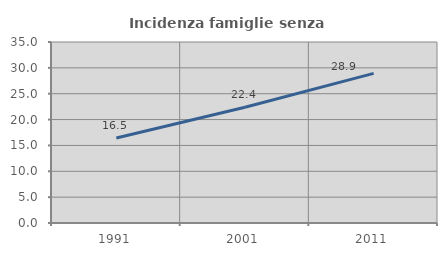
| Category | Incidenza famiglie senza nuclei |
|---|---|
| 1991.0 | 16.453 |
| 2001.0 | 22.391 |
| 2011.0 | 28.925 |